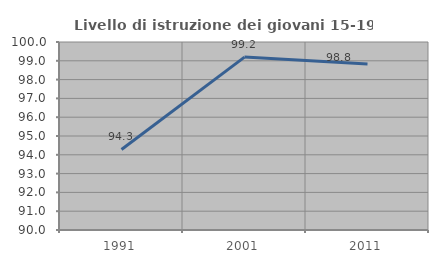
| Category | Livello di istruzione dei giovani 15-19 anni |
|---|---|
| 1991.0 | 94.286 |
| 2001.0 | 99.197 |
| 2011.0 | 98.824 |